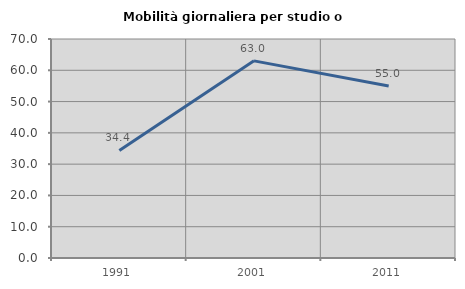
| Category | Mobilità giornaliera per studio o lavoro |
|---|---|
| 1991.0 | 34.4 |
| 2001.0 | 63.014 |
| 2011.0 | 54.95 |